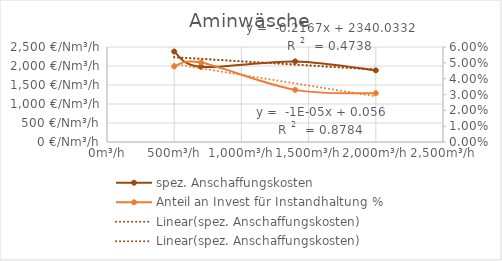
| Category | spez. Anschaffungskosten |
|---|---|
| 500.0 | 2379.966 |
| 700.0 | 1978.481 |
| 1400.0 | 2120.526 |
| 2000.0 | 1884.206 |